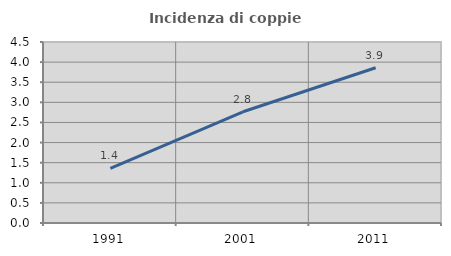
| Category | Incidenza di coppie miste |
|---|---|
| 1991.0 | 1.359 |
| 2001.0 | 2.765 |
| 2011.0 | 3.859 |